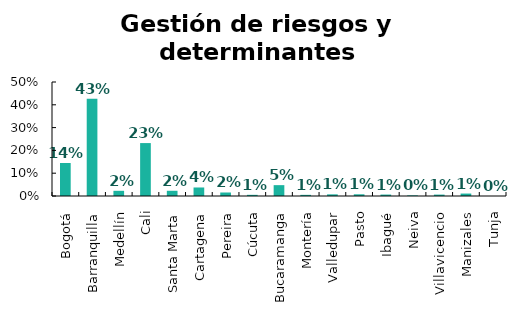
| Category | Gestión de riesgos y determinantes ambientales |
|---|---|
| Bogotá | 0.145 |
| Barranquilla | 0.427 |
| Medellín | 0.023 |
| Cali | 0.232 |
| Santa Marta | 0.023 |
| Cartagena | 0.037 |
| Pereira | 0.015 |
| Cúcuta | 0.005 |
| Bucaramanga | 0.048 |
| Montería | 0.005 |
| Valledupar | 0.007 |
| Pasto | 0.007 |
| Ibagué | 0.006 |
| Neiva | 0.003 |
| Villavicencio | 0.006 |
| Manizales | 0.011 |
| Tunja | 0 |